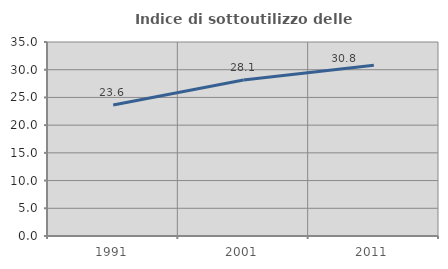
| Category | Indice di sottoutilizzo delle abitazioni  |
|---|---|
| 1991.0 | 23.626 |
| 2001.0 | 28.142 |
| 2011.0 | 30.815 |